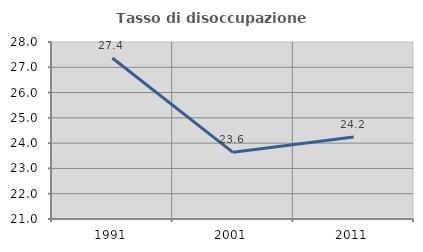
| Category | Tasso di disoccupazione giovanile  |
|---|---|
| 1991.0 | 27.368 |
| 2001.0 | 23.636 |
| 2011.0 | 24.242 |